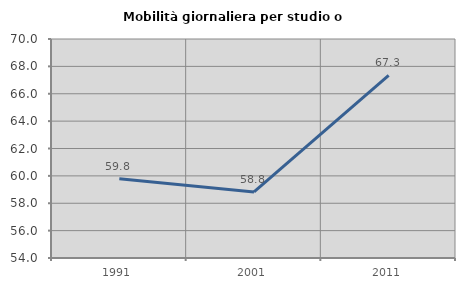
| Category | Mobilità giornaliera per studio o lavoro |
|---|---|
| 1991.0 | 59.788 |
| 2001.0 | 58.824 |
| 2011.0 | 67.335 |